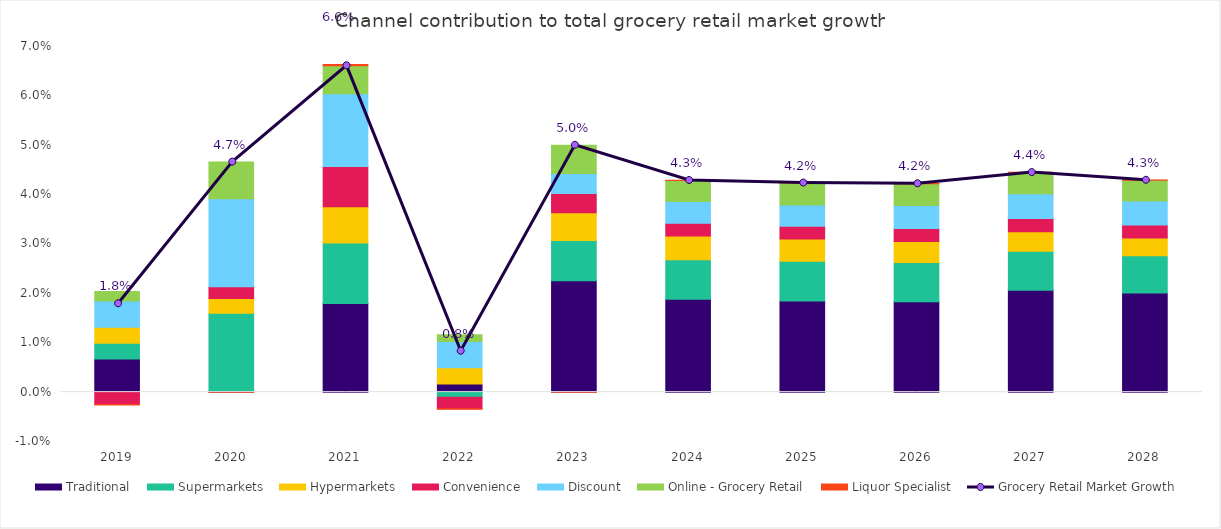
| Category | Traditional | Supermarkets | Hypermarkets | Convenience | Discount | Online - Grocery Retail | Liquor Specialist |
|---|---|---|---|---|---|---|---|
| 2019.0 | 0.007 | 0.003 | 0.003 | -0.003 | 0.005 | 0.002 | 0 |
| 2020.0 | 0 | 0.016 | 0.003 | 0.002 | 0.018 | 0.007 | 0 |
| 2021.0 | 0.018 | 0.012 | 0.007 | 0.008 | 0.015 | 0.006 | 0 |
| 2022.0 | 0.002 | -0.001 | 0.003 | -0.002 | 0.005 | 0.001 | 0 |
| 2023.0 | 0.023 | 0.008 | 0.006 | 0.004 | 0.004 | 0.006 | 0 |
| 2024.0 | 0.019 | 0.008 | 0.005 | 0.003 | 0.004 | 0.004 | 0 |
| 2025.0 | 0.018 | 0.008 | 0.005 | 0.003 | 0.004 | 0.004 | 0 |
| 2026.0 | 0.018 | 0.008 | 0.004 | 0.003 | 0.005 | 0.004 | 0 |
| 2027.0 | 0.021 | 0.008 | 0.004 | 0.003 | 0.005 | 0.004 | 0 |
| 2028.0 | 0.02 | 0.008 | 0.004 | 0.003 | 0.005 | 0.004 | 0 |